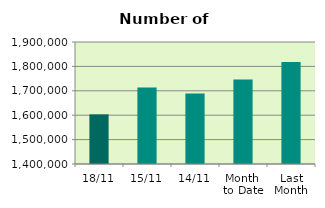
| Category | Series 0 |
|---|---|
| 18/11 | 1603440 |
| 15/11 | 1713698 |
| 14/11 | 1689048 |
| Month 
to Date | 1745961.5 |
| Last
Month | 1817802.609 |